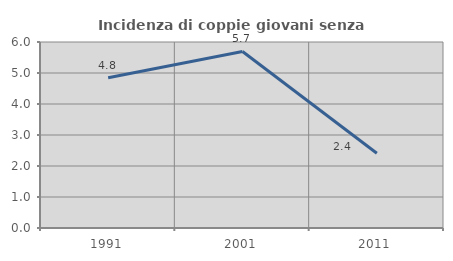
| Category | Incidenza di coppie giovani senza figli |
|---|---|
| 1991.0 | 4.847 |
| 2001.0 | 5.695 |
| 2011.0 | 2.412 |